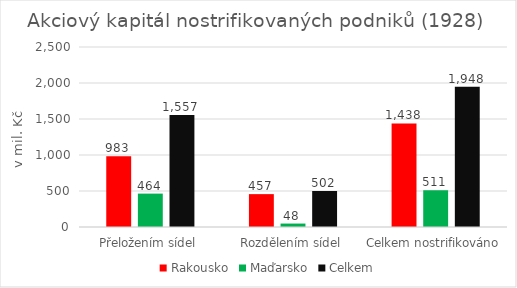
| Category | Rakousko | Maďarsko | Celkem |
|---|---|---|---|
| Přeložením sídel | 983 | 463.8 | 1556.8 |
| Rozdělením sídel | 456.6 | 47.8 | 501.6 |
| Celkem nostrifikováno | 1437.6 | 510.8 | 1948.4 |